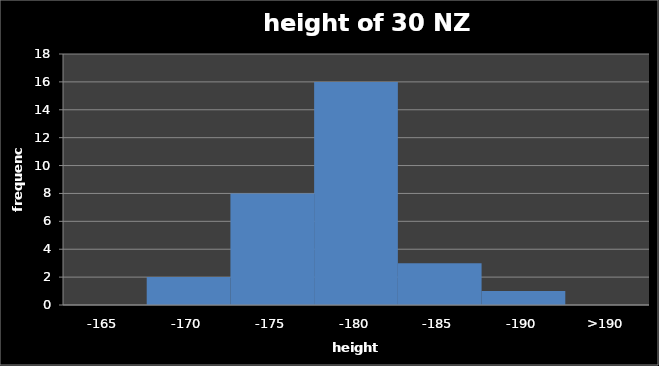
| Category | sample 30 |
|---|---|
| -165 | 0 |
| -170 | 2 |
| -175 | 8 |
| -180 | 16 |
| -185 | 3 |
| -190 | 1 |
| >190 | 0 |